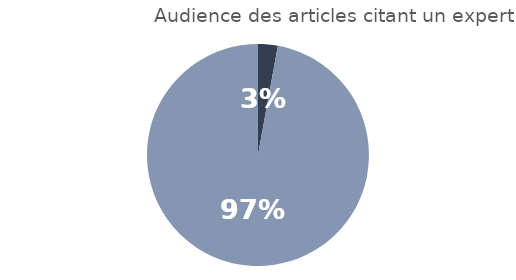
| Category | Series 0 |
|---|---|
| 0 | 0.029 |
| 1 | 0.971 |